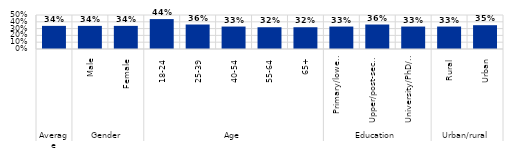
| Category | Series 0 |
|---|---|
| 0 | 0.34 |
| 1 | 0.34 |
| 2 | 0.34 |
| 3 | 0.44 |
| 4 | 0.36 |
| 5 | 0.33 |
| 6 | 0.32 |
| 7 | 0.32 |
| 8 | 0.33 |
| 9 | 0.36 |
| 10 | 0.33 |
| 11 | 0.33 |
| 12 | 0.35 |